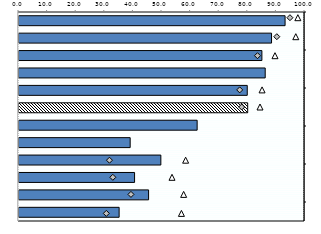
| Category | 25-64 |
|---|---|
| 0 | 93.035 |
| 1 | 88.3 |
| 2 | 84.931 |
| 3 | 86.09 |
| 4 | 79.81 |
| 5 | 79.962 |
| 6 | 62.29 |
| 7 | 38.874 |
| 8 | 49.6 |
| 9 | 40.412 |
| 10 | 45.31 |
| 11 | 35.012 |